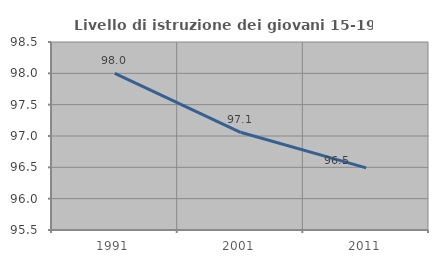
| Category | Livello di istruzione dei giovani 15-19 anni |
|---|---|
| 1991.0 | 98 |
| 2001.0 | 97.059 |
| 2011.0 | 96.491 |